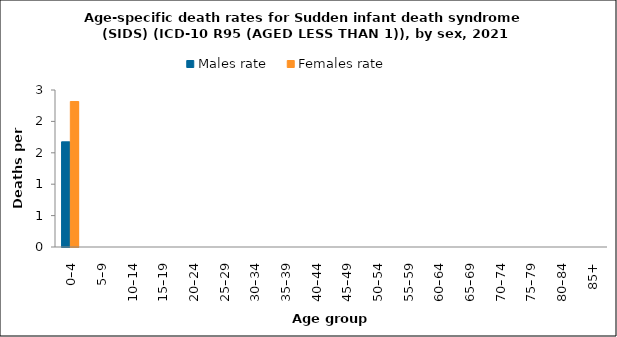
| Category | Males rate | Females rate |
|---|---|---|
| 0–4 | 1.675 | 2.317 |
| 5–9 | 0 | 0 |
| 10–14 | 0 | 0 |
| 15–19 | 0 | 0 |
| 20–24 | 0 | 0 |
| 25–29 | 0 | 0 |
| 30–34 | 0 | 0 |
| 35–39 | 0 | 0 |
| 40–44 | 0 | 0 |
| 45–49 | 0 | 0 |
| 50–54 | 0 | 0 |
| 55–59 | 0 | 0 |
| 60–64 | 0 | 0 |
| 65–69 | 0 | 0 |
| 70–74 | 0 | 0 |
| 75–79 | 0 | 0 |
| 80–84 | 0 | 0 |
| 85+ | 0 | 0 |